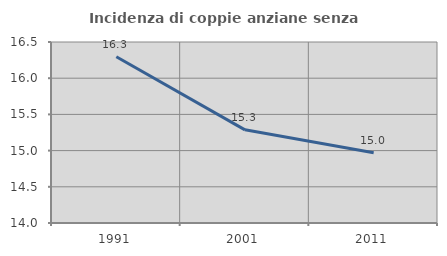
| Category | Incidenza di coppie anziane senza figli  |
|---|---|
| 1991.0 | 16.296 |
| 2001.0 | 15.287 |
| 2011.0 | 14.97 |